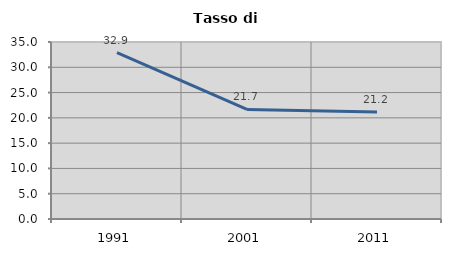
| Category | Tasso di disoccupazione   |
|---|---|
| 1991.0 | 32.88 |
| 2001.0 | 21.667 |
| 2011.0 | 21.17 |